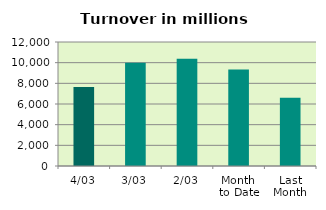
| Category | Series 0 |
|---|---|
| 4/03 | 7650.55 |
| 3/03 | 9985.433 |
| 2/03 | 10381.276 |
| Month 
to Date | 9339.087 |
| Last
Month | 6605.047 |